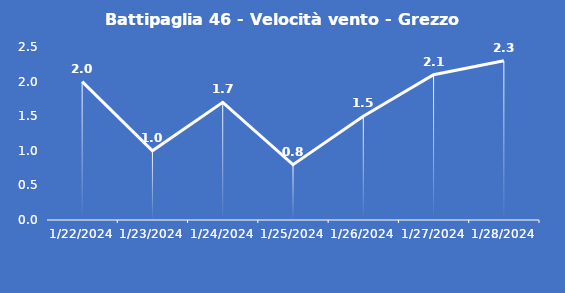
| Category | Battipaglia 46 - Velocità vento - Grezzo (m/s) |
|---|---|
| 1/22/24 | 2 |
| 1/23/24 | 1 |
| 1/24/24 | 1.7 |
| 1/25/24 | 0.8 |
| 1/26/24 | 1.5 |
| 1/27/24 | 2.1 |
| 1/28/24 | 2.3 |